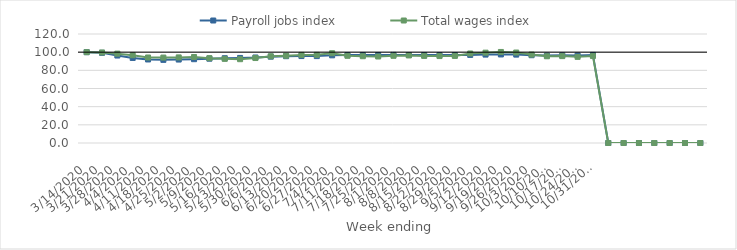
| Category | Payroll jobs index | Total wages index |
|---|---|---|
| 14/03/2020 | 100 | 100 |
| 21/03/2020 | 99.261 | 99.662 |
| 28/03/2020 | 96.28 | 98.386 |
| 04/04/2020 | 93.636 | 96.64 |
| 11/04/2020 | 91.95 | 94.142 |
| 18/04/2020 | 91.517 | 94.044 |
| 25/04/2020 | 91.861 | 94.24 |
| 02/05/2020 | 92.261 | 94.675 |
| 09/05/2020 | 92.816 | 93.417 |
| 16/05/2020 | 93.349 | 92.645 |
| 23/05/2020 | 93.653 | 92.27 |
| 30/05/2020 | 94.153 | 93.543 |
| 06/06/2020 | 95.073 | 95.449 |
| 13/06/2020 | 95.572 | 96.097 |
| 20/06/2020 | 95.727 | 96.992 |
| 27/06/2020 | 95.674 | 97.05 |
| 04/07/2020 | 96.519 | 98.837 |
| 11/07/2020 | 96.892 | 95.976 |
| 18/07/2020 | 96.803 | 95.549 |
| 25/07/2020 | 96.894 | 95.223 |
| 01/08/2020 | 97.004 | 95.974 |
| 08/08/2020 | 96.893 | 96.39 |
| 15/08/2020 | 96.793 | 95.878 |
| 22/08/2020 | 96.797 | 95.7 |
| 29/08/2020 | 96.807 | 95.852 |
| 05/09/2020 | 96.983 | 98.536 |
| 12/09/2020 | 97.328 | 99.459 |
| 19/09/2020 | 97.472 | 100.228 |
| 26/09/2020 | 97.305 | 99.582 |
| 03/10/2020 | 96.626 | 97.348 |
| 10/10/2020 | 96.269 | 95.474 |
| 17/10/2020 | 96.502 | 95.648 |
| 24/10/2020 | 96.383 | 94.829 |
| 31/10/2020 | 96.953 | 95.711 |